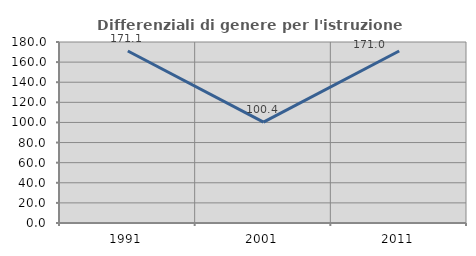
| Category | Differenziali di genere per l'istruzione superiore |
|---|---|
| 1991.0 | 171.053 |
| 2001.0 | 100.392 |
| 2011.0 | 171.034 |